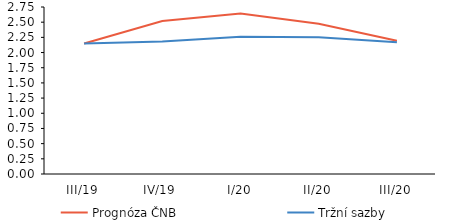
| Category | Prognóza ČNB | Tržní sazby |
|---|---|---|
| III/19 | 2.15 | 2.15 |
| IV/19 | 2.519 | 2.18 |
| I/20 | 2.642 | 2.26 |
| II/20 | 2.472 | 2.25 |
| III/20 | 2.196 | 2.17 |